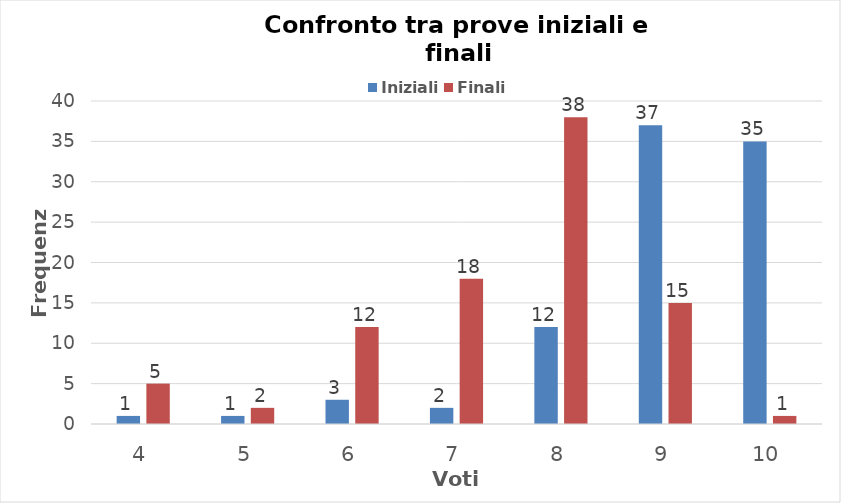
| Category | Iniziali | Finali |
|---|---|---|
| 4.0 | 1 | 5 |
| 5.0 | 1 | 2 |
| 6.0 | 3 | 12 |
| 7.0 | 2 | 18 |
| 8.0 | 12 | 38 |
| 9.0 | 37 | 15 |
| 10.0 | 35 | 1 |